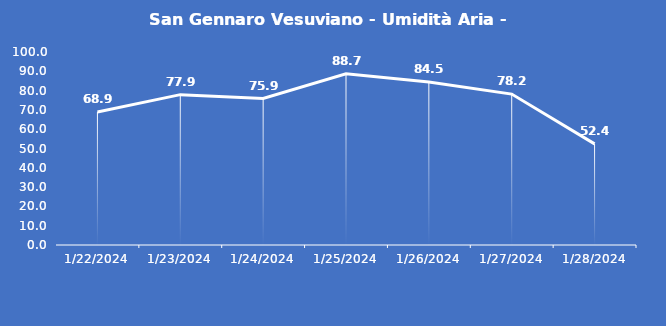
| Category | San Gennaro Vesuviano - Umidità Aria - Grezzo (%) |
|---|---|
| 1/22/24 | 68.9 |
| 1/23/24 | 77.9 |
| 1/24/24 | 75.9 |
| 1/25/24 | 88.7 |
| 1/26/24 | 84.5 |
| 1/27/24 | 78.2 |
| 1/28/24 | 52.4 |